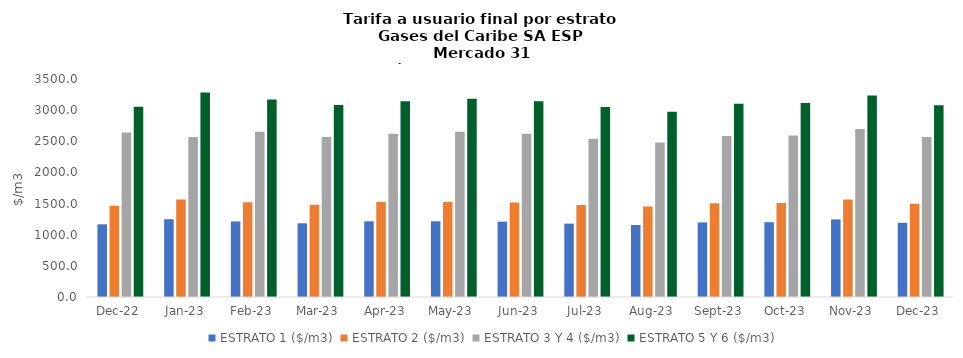
| Category | ESTRATO 1 ($/m3) | ESTRATO 2 ($/m3) | ESTRATO 3 Y 4 ($/m3) | ESTRATO 5 Y 6 ($/m3) |
|---|---|---|---|---|
| 2022-12-01 | 1166.58 | 1463.43 | 2641.83 | 3053.088 |
| 2023-01-01 | 1248.7 | 1565.89 | 2568.94 | 3283.236 |
| 2023-02-01 | 1212.89 | 1521.57 | 2651.33 | 3170.196 |
| 2023-03-01 | 1183.19 | 1482.78 | 2568.94 | 3082.728 |
| 2023-04-01 | 1215.25 | 1524.46 | 2619.03 | 3142.836 |
| 2023-05-01 | 1215.25 | 1524.46 | 2651.33 | 3181.596 |
| 2023-06-01 | 1209.41 | 1517.12 | 2619.03 | 3142.836 |
| 2023-07-01 | 1178 | 1477.97 | 2542.18 | 3050.616 |
| 2023-08-01 | 1155.93 | 1451.92 | 2479.28 | 2975.136 |
| 2023-09-01 | 1198 | 1503.27 | 2586.8 | 3104.16 |
| 2023-10-01 | 1201.13 | 1507.69 | 2594.42 | 3113.304 |
| 2023-11-01 | 1245.69 | 1564.66 | 2697.24 | 3236.688 |
| 2023-12-01 | 1191.7 | 1497.74 | 2567.03 | 3080.436 |